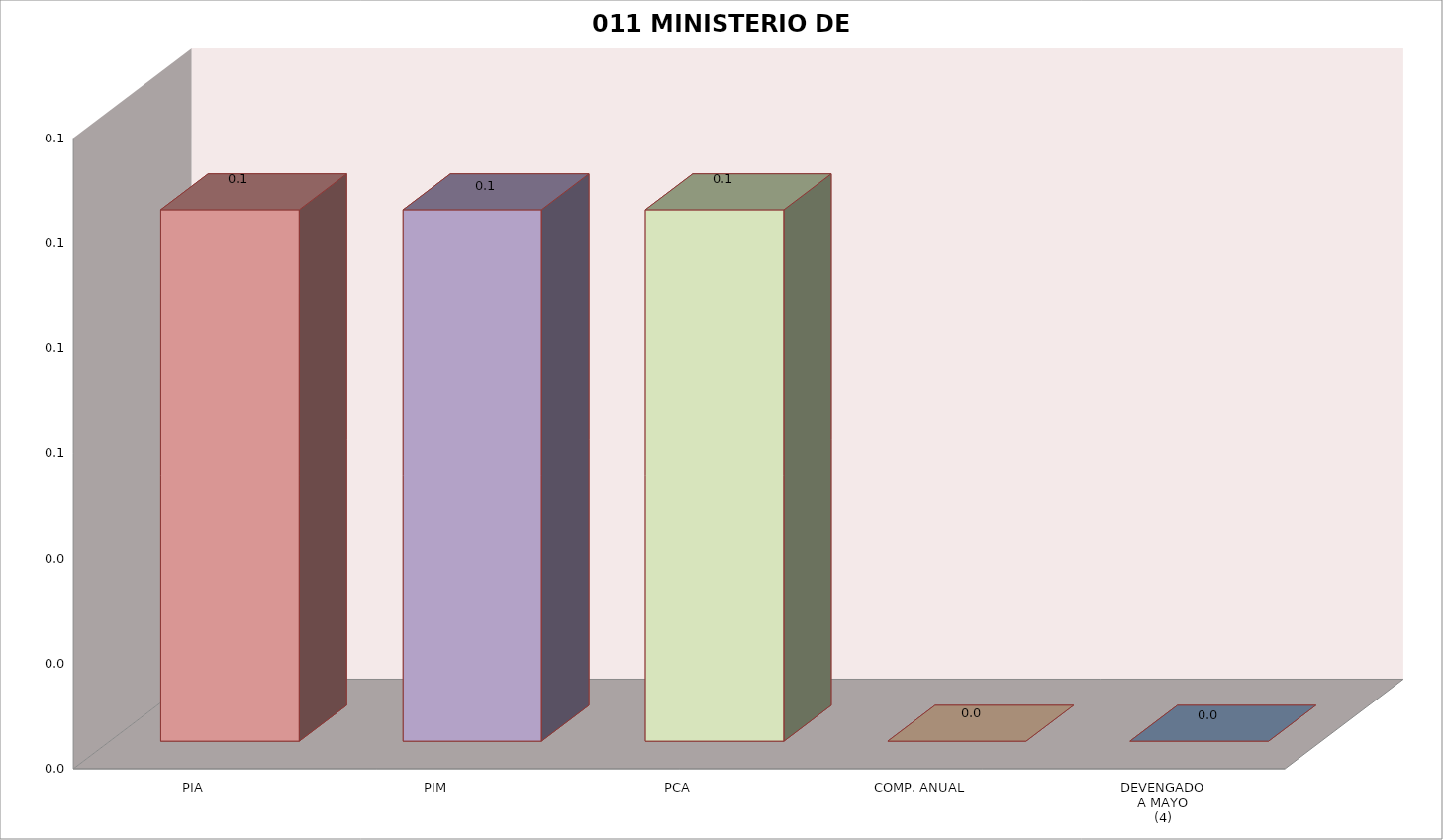
| Category | 011 MINISTERIO DE SALUD |
|---|---|
| PIA | 0.101 |
| PIM | 0.101 |
| PCA | 0.101 |
| COMP. ANUAL | 0 |
| DEVENGADO
A MAYO
(4) | 0 |